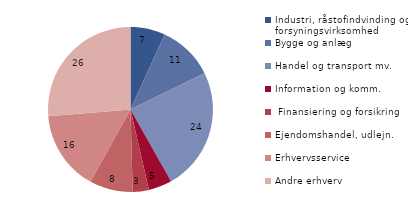
| Category | Series 0 |
|---|---|
| Industri, råstofindvinding og forsyningsvirksomhed | 6.794 |
| Bygge og anlæg | 10.945 |
| Handel og transport mv. | 24.084 |
| Information og komm. | 4.588 |
|  Finansiering og forsikring | 3.171 |
| Ejendomshandel, udlejn. | 8.488 |
| Erhvervsservice | 15.633 |
| Andre erhverv | 26.298 |